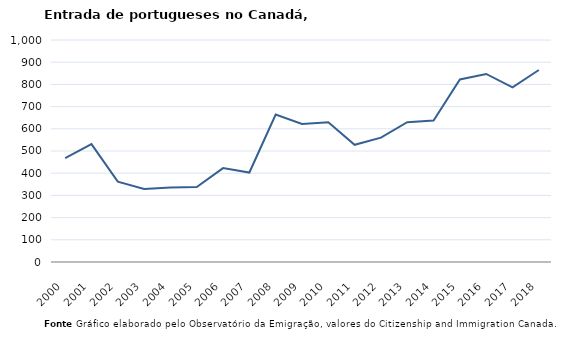
| Category | Entradas |
|---|---|
| 2000.0 | 468 |
| 2001.0 | 531 |
| 2002.0 | 362 |
| 2003.0 | 329 |
| 2004.0 | 336 |
| 2005.0 | 338 |
| 2006.0 | 423 |
| 2007.0 | 403 |
| 2008.0 | 664 |
| 2009.0 | 622 |
| 2010.0 | 629 |
| 2011.0 | 528 |
| 2012.0 | 560 |
| 2013.0 | 630 |
| 2014.0 | 637 |
| 2015.0 | 822 |
| 2016.0 | 847 |
| 2017.0 | 787 |
| 2018.0 | 865 |